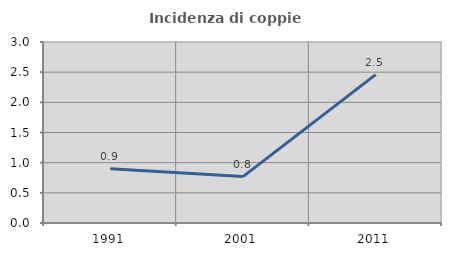
| Category | Incidenza di coppie miste |
|---|---|
| 1991.0 | 0.901 |
| 2001.0 | 0.769 |
| 2011.0 | 2.459 |